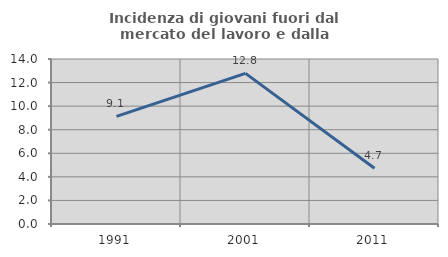
| Category | Incidenza di giovani fuori dal mercato del lavoro e dalla formazione  |
|---|---|
| 1991.0 | 9.129 |
| 2001.0 | 12.778 |
| 2011.0 | 4.73 |